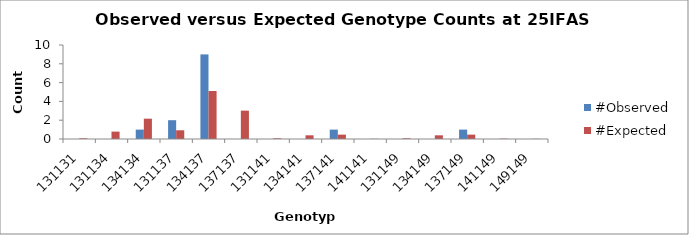
| Category | #Observed | #Expected |
|---|---|---|
| 131131.0 | 0 | 0.071 |
| 131134.0 | 0 | 0.786 |
| 134134.0 | 1 | 2.161 |
| 131137.0 | 2 | 0.929 |
| 134137.0 | 9 | 5.107 |
| 137137.0 | 0 | 3.018 |
| 131141.0 | 0 | 0.071 |
| 134141.0 | 0 | 0.393 |
| 137141.0 | 1 | 0.464 |
| 141141.0 | 0 | 0.018 |
| 131149.0 | 0 | 0.071 |
| 134149.0 | 0 | 0.393 |
| 137149.0 | 1 | 0.464 |
| 141149.0 | 0 | 0.036 |
| 149149.0 | 0 | 0.018 |